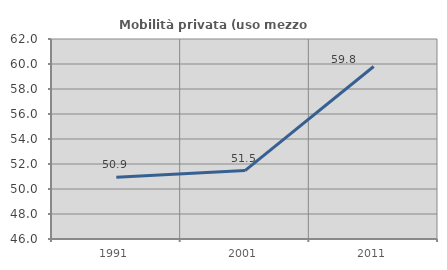
| Category | Mobilità privata (uso mezzo privato) |
|---|---|
| 1991.0 | 50.939 |
| 2001.0 | 51.476 |
| 2011.0 | 59.8 |